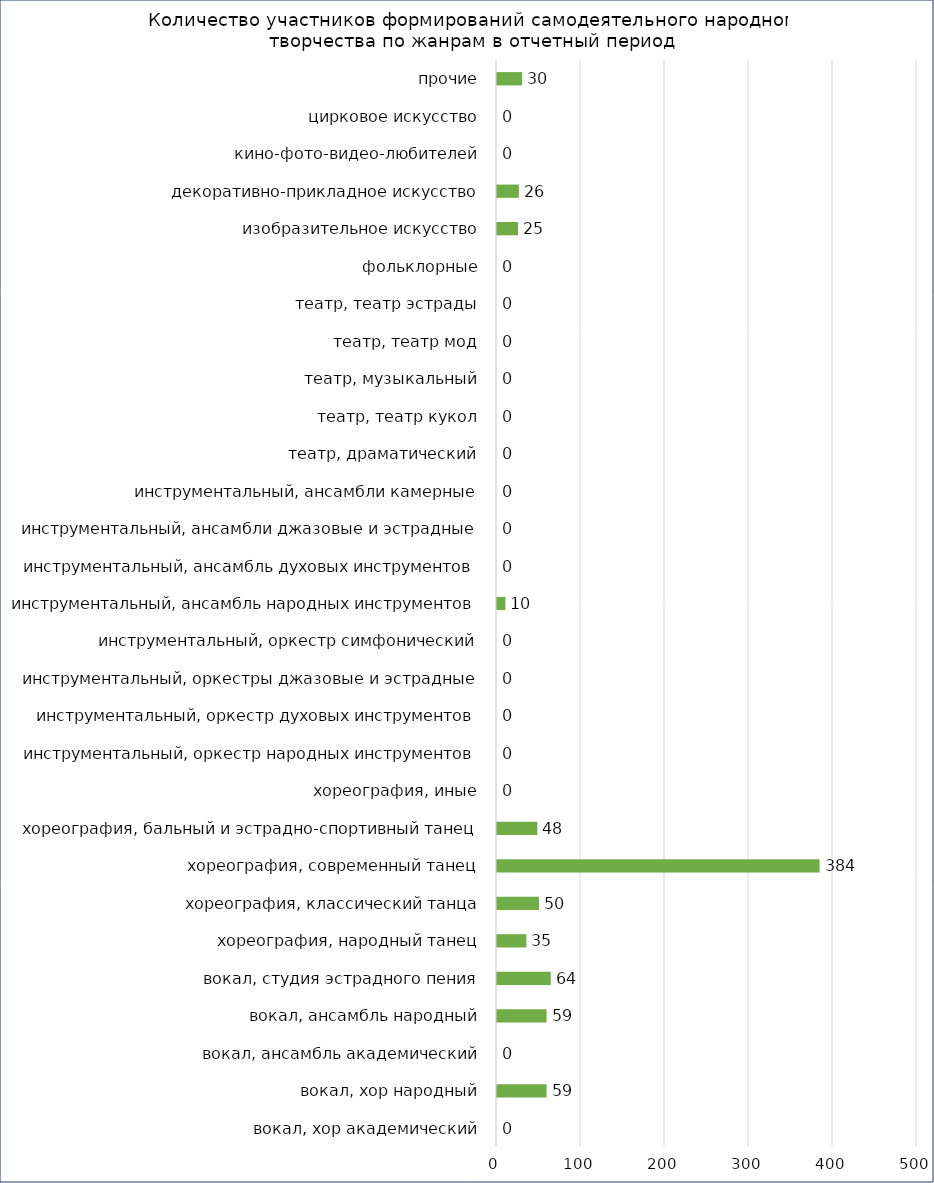
| Category | Кол-во участников всего |
|---|---|
| вокал, хор академический | 0 |
| вокал, хор народный | 59 |
| вокал, ансамбль академический | 0 |
| вокал, ансамбль народный | 59 |
| вокал, студия эстрадного пения | 64 |
| хореография, народный танец | 35 |
| хореография, классический танца | 50 |
| хореография, современный танец | 384 |
| хореография, бальный и эстрадно-спортивный танец | 48 |
| хореография, иные | 0 |
| инструментальный, оркестр народных инструментов | 0 |
| инструментальный, оркестр духовых инструментов | 0 |
| инструментальный, оркестры джазовые и эстрадные | 0 |
| инструментальный, оркестр симфонический | 0 |
| инструментальный, ансамбль народных инструментов | 10 |
| инструментальный, ансамбль духовых инструментов | 0 |
| инструментальный, ансамбли джазовые и эстрадные | 0 |
| инструментальный, ансамбли камерные | 0 |
| театр, драматический | 0 |
| театр, театр кукол | 0 |
| театр, музыкальный | 0 |
| театр, театр мод | 0 |
| театр, театр эстрады | 0 |
| фольклорные | 0 |
| изобразительное искусство | 25 |
| декоративно-прикладное искусство | 26 |
| кино-фото-видео-любителей | 0 |
| цирковое искусство | 0 |
| прочие | 30 |